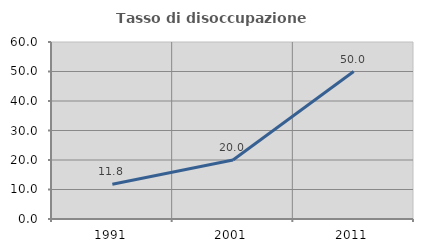
| Category | Tasso di disoccupazione giovanile  |
|---|---|
| 1991.0 | 11.765 |
| 2001.0 | 20 |
| 2011.0 | 50 |